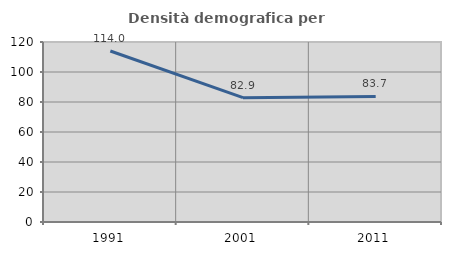
| Category | Densità demografica |
|---|---|
| 1991.0 | 114.005 |
| 2001.0 | 82.879 |
| 2011.0 | 83.744 |